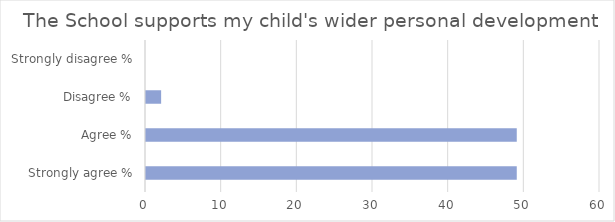
| Category | Series 1 |
|---|---|
| Strongly agree % | 49 |
| Agree % | 49 |
| Disagree % | 2 |
| Strongly disagree % | 0 |